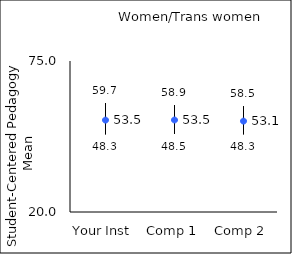
| Category | 25th percentile | 75th percentile | Mean |
|---|---|---|---|
| Your Inst | 48.3 | 59.7 | 53.47 |
| Comp 1 | 48.5 | 58.9 | 53.51 |
| Comp 2 | 48.3 | 58.5 | 53.1 |